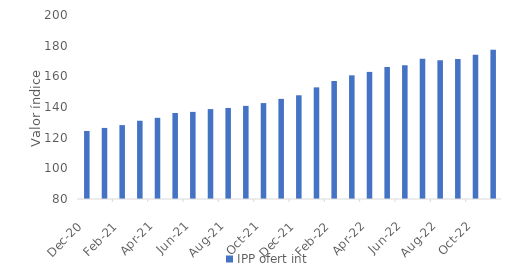
| Category | IPP ofert int |
|---|---|
| 2020-12-01 | 124.38 |
| 2021-01-01 | 126.36 |
| 2021-02-01 | 128.19 |
| 2021-03-01 | 131.04 |
| 2021-04-01 | 132.94 |
| 2021-05-01 | 136.1 |
| 2021-06-01 | 136.81 |
| 2021-07-01 | 138.63 |
| 2021-08-01 | 139.38 |
| 2021-09-01 | 140.73 |
| 2021-10-01 | 142.56 |
| 2021-11-01 | 145.3 |
| 2021-12-01 | 147.65 |
| 2022-01-01 | 152.8 |
| 2022-02-01 | 156.94 |
| 2022-03-01 | 160.65 |
| 2022-04-01 | 162.89 |
| 2022-05-01 | 166.16 |
| 2022-06-01 | 167.21 |
| 2022-07-01 | 171.4 |
| 2022-08-01 | 170.53 |
| 2022-09-01 | 171.26 |
| 2022-10-01 | 174.12 |
| 2022-11-01 | 177.36 |